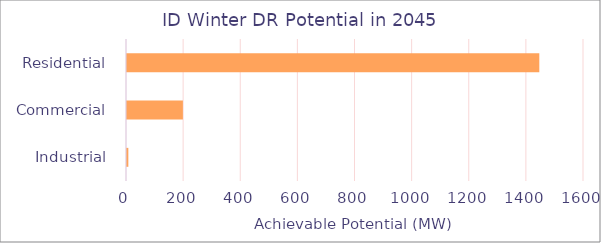
| Category | Series 0 |
|---|---|
|  Residential  | 1447.026 |
|  Commercial  | 199.206 |
|  Industrial  | 8.208 |